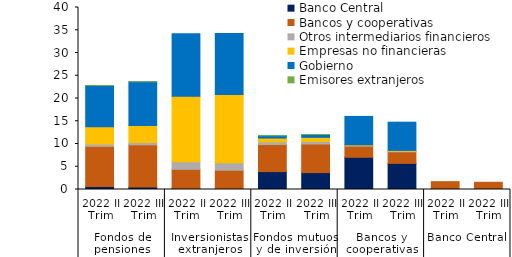
| Category | Banco Central | Bancos y cooperativas | Otros intermediarios financieros | Empresas no financieras | Gobierno  | Emisores extranjeros |
|---|---|---|---|---|---|---|
| 0 | 0.668 | 8.81 | 0.505 | 3.785 | 9.088 | 0.01 |
| 1 | 0.563 | 9.254 | 0.509 | 3.735 | 9.613 | 0.01 |
| 2 | 0.158 | 4.273 | 1.689 | 14.387 | 13.72 | 0 |
| 3 | 0.031 | 4.192 | 1.684 | 14.989 | 13.418 | 0 |
| 4 | 3.931 | 5.946 | 0.591 | 0.838 | 0.502 | 0 |
| 5 | 3.71 | 6.285 | 0.584 | 0.887 | 0.621 | 0 |
| 6 | 7.076 | 2.448 | 0.149 | 0.143 | 6.246 | 0 |
| 7 | 5.74 | 2.544 | 0.152 | 0.157 | 6.2 | 0 |
| 8 | 0 | 1.724 | 0 | 0 | 0 | 0 |
| 9 | 0 | 1.587 | 0 | 0 | 0 | 0 |